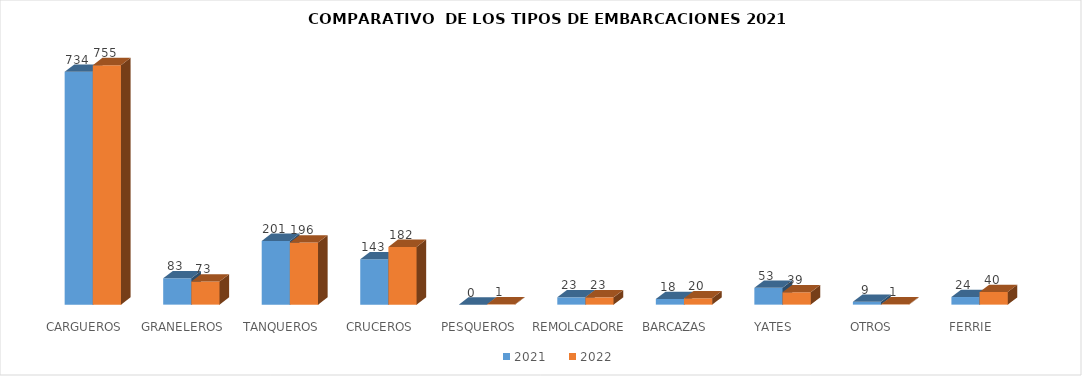
| Category | 2021 | 2022 |
|---|---|---|
| CARGUEROS | 734 | 755 |
| GRANELEROS | 83 | 73 |
| TANQUEROS | 201 | 196 |
| CRUCEROS | 143 | 182 |
| PESQUEROS | 0 | 1 |
| REMOLCADORES | 23 | 23 |
| BARCAZAS | 18 | 20 |
| YATES | 53 | 39 |
| OTROS  | 9 | 1 |
| FERRIE | 24 | 40 |